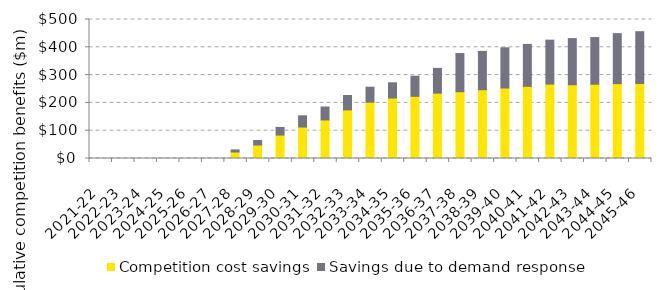
| Category | Competition cost savings | Savings due to demand response |
|---|---|---|
| 2021-22 | 0 | 0 |
| 2022-23 | 0 | 0 |
| 2023-24 | 0 | 0 |
| 2024-25 | 0 | 0 |
| 2025-26 | 0 | 0 |
| 2026-27 | 0 | 0 |
| 2027-28 | 23.38 | 7.469 |
| 2028-29 | 48.571 | 16.272 |
| 2029-30 | 84.261 | 27.53 |
| 2030-31 | 113.183 | 40.314 |
| 2031-32 | 138.671 | 46.664 |
| 2032-33 | 174.817 | 51.78 |
| 2033-34 | 202.679 | 53.764 |
| 2034-35 | 217.517 | 54.855 |
| 2035-36 | 223.676 | 72.317 |
| 2036-37 | 235.01 | 89.02 |
| 2037-38 | 240.219 | 137.282 |
| 2038-39 | 247.407 | 137.912 |
| 2039-40 | 253.672 | 144.601 |
| 2040-41 | 259.511 | 150.941 |
| 2041-42 | 267.764 | 157.884 |
| 2042-43 | 265.324 | 165.898 |
| 2043-44 | 267.139 | 167.955 |
| 2044-45 | 269.3 | 179.795 |
| 2045-46 | 269.747 | 186.383 |